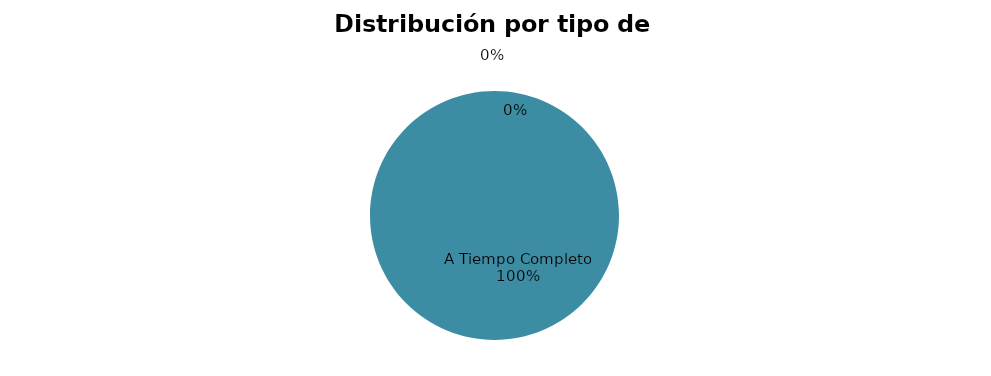
| Category | 14 |
|---|---|
| A Tiempo Completo | 14 |